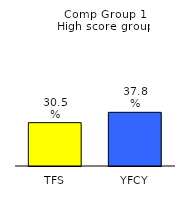
| Category | Series 0 |
|---|---|
| TFS | 0.305 |
| YFCY | 0.378 |